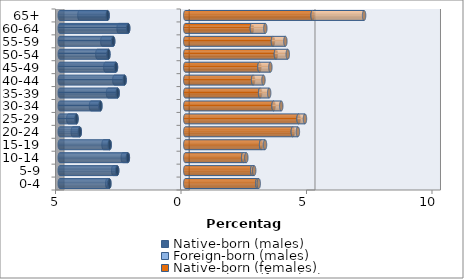
| Category | Native-born (males) | Foreign-born (males) | Native-born (females) | Foreign-born (females) |
|---|---|---|---|---|
| 0-4 | -3.024 | -0.084 | 2.87 | 0.058 |
| 5-9 | -2.712 | -0.159 | 2.667 | 0.08 |
| 10-14 | -2.286 | -0.204 | 2.307 | 0.126 |
| 15-19 | -3.012 | -0.245 | 3.021 | 0.157 |
| 20-24 | -4.202 | -0.28 | 4.286 | 0.202 |
| 25-29 | -4.333 | -0.328 | 4.514 | 0.255 |
| 30-34 | -3.381 | -0.375 | 3.516 | 0.309 |
| 35-39 | -2.693 | -0.383 | 2.982 | 0.361 |
| 40-44 | -2.416 | -0.409 | 2.702 | 0.414 |
| 45-49 | -2.76 | -0.425 | 2.955 | 0.436 |
| 50-54 | -3.061 | -0.443 | 3.611 | 0.473 |
| 55-59 | -2.871 | -0.433 | 3.494 | 0.494 |
| 60-64 | -2.273 | -0.384 | 2.654 | 0.537 |
| 65+ | -3.092 | -1.125 | 5.076 | 2.05 |